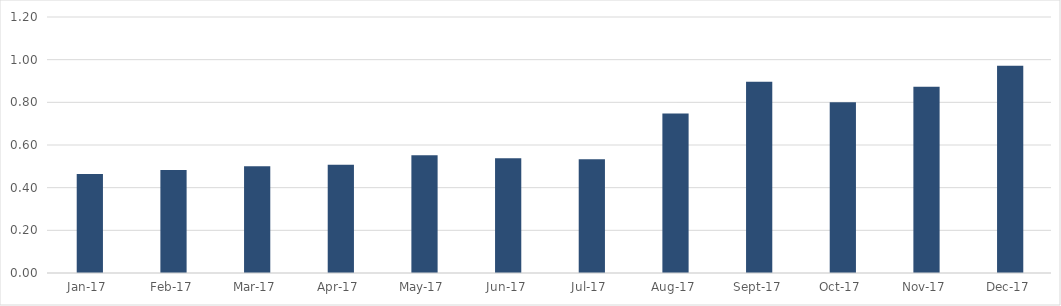
| Category | Коэффициент Дельта |
|---|---|
| 2017-01-01 | 0.464 |
| 2017-02-01 | 0.483 |
| 2017-03-01 | 0.5 |
| 2017-04-01 | 0.508 |
| 2017-05-01 | 0.552 |
| 2017-06-01 | 0.538 |
| 2017-07-01 | 0.533 |
| 2017-08-01 | 0.748 |
| 2017-09-01 | 0.897 |
| 2017-10-01 | 0.8 |
| 2017-11-01 | 0.873 |
| 2017-12-01 | 0.971 |